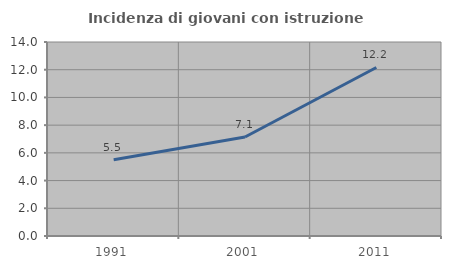
| Category | Incidenza di giovani con istruzione universitaria |
|---|---|
| 1991.0 | 5.505 |
| 2001.0 | 7.143 |
| 2011.0 | 12.162 |